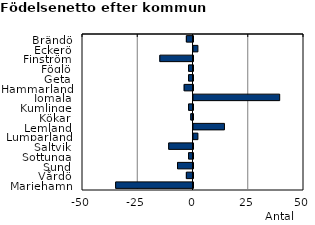
| Category | Series 0 |
|---|---|
| Brändö | -3 |
| Eckerö | 2 |
| Finström | -15 |
| Föglö | -2 |
| Geta | -2 |
| Hammarland | -4 |
| Jomala | 39 |
| Kumlinge | -2 |
| Kökar | -1 |
| Lemland | 14 |
| Lumparland | 2 |
| Saltvik | -11 |
| Sottunga | -2 |
| Sund | -7 |
| Vårdö | -3 |
| Mariehamn | -35 |